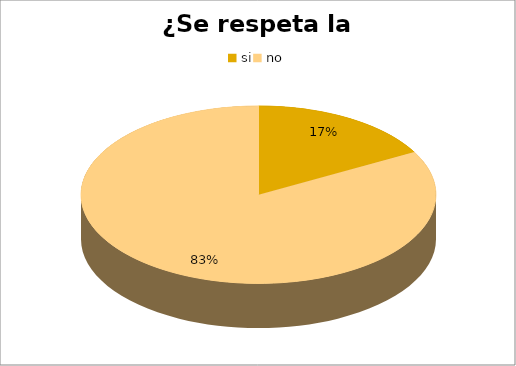
| Category | Series 0 |
|---|---|
| si | 16 |
| no | 78 |